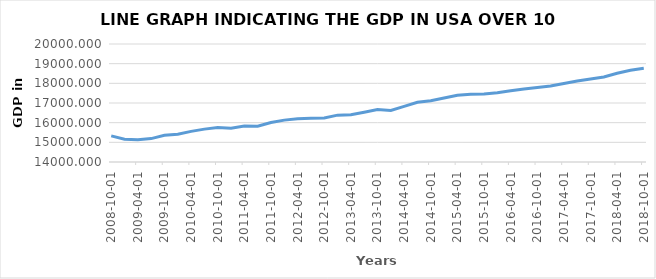
| Category | GDPC1 |
|---|---|
| 2008-10-01 | 15328.027 |
| 2009-01-01 | 15155.94 |
| 2009-04-01 | 15134.117 |
| 2009-07-01 | 15189.222 |
| 2009-10-01 | 15356.058 |
| 2010-01-01 | 15415.145 |
| 2010-04-01 | 15557.277 |
| 2010-07-01 | 15671.967 |
| 2010-10-01 | 15750.625 |
| 2011-01-01 | 15712.754 |
| 2011-04-01 | 15825.096 |
| 2011-07-01 | 15820.7 |
| 2011-10-01 | 16004.107 |
| 2012-01-01 | 16129.418 |
| 2012-04-01 | 16198.807 |
| 2012-07-01 | 16220.667 |
| 2012-10-01 | 16239.138 |
| 2013-01-01 | 16382.964 |
| 2013-04-01 | 16403.18 |
| 2013-07-01 | 16531.685 |
| 2013-10-01 | 16663.649 |
| 2014-01-01 | 16621.696 |
| 2014-04-01 | 16830.111 |
| 2014-07-01 | 17033.572 |
| 2014-10-01 | 17113.945 |
| 2015-01-01 | 17254.744 |
| 2015-04-01 | 17397.029 |
| 2015-07-01 | 17438.802 |
| 2015-10-01 | 17456.225 |
| 2016-01-01 | 17523.374 |
| 2016-04-01 | 17622.486 |
| 2016-07-01 | 17706.705 |
| 2016-10-01 | 17784.185 |
| 2017-01-01 | 17863.023 |
| 2017-04-01 | 17995.15 |
| 2017-07-01 | 18120.843 |
| 2017-10-01 | 18223.758 |
| 2018-01-01 | 18323.963 |
| 2018-04-01 | 18511.576 |
| 2018-07-01 | 18664.973 |
| 2018-10-01 | 18765.256 |